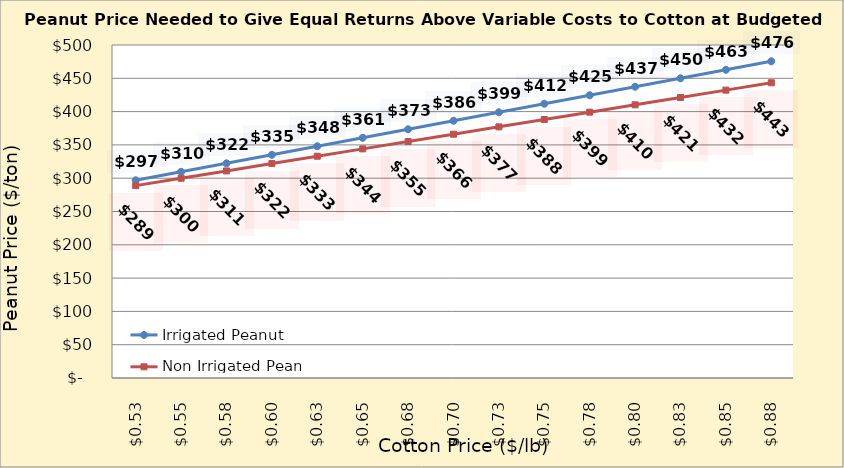
| Category | Irrigated Peanut | Non Irrigated Peanut |
|---|---|---|
| 0.5249999999999998 | 296.858 | 288.866 |
| 0.5499999999999998 | 309.624 | 299.896 |
| 0.5749999999999998 | 322.39 | 310.925 |
| 0.5999999999999999 | 335.156 | 321.954 |
| 0.6249999999999999 | 347.922 | 332.984 |
| 0.6499999999999999 | 360.688 | 344.013 |
| 0.6749999999999999 | 373.454 | 355.043 |
| 0.7 | 386.22 | 366.072 |
| 0.725 | 398.986 | 377.102 |
| 0.75 | 411.752 | 388.131 |
| 0.775 | 424.518 | 399.16 |
| 0.8 | 437.284 | 410.19 |
| 0.8250000000000001 | 450.05 | 421.219 |
| 0.8500000000000001 | 462.816 | 432.249 |
| 0.8750000000000001 | 475.582 | 443.278 |